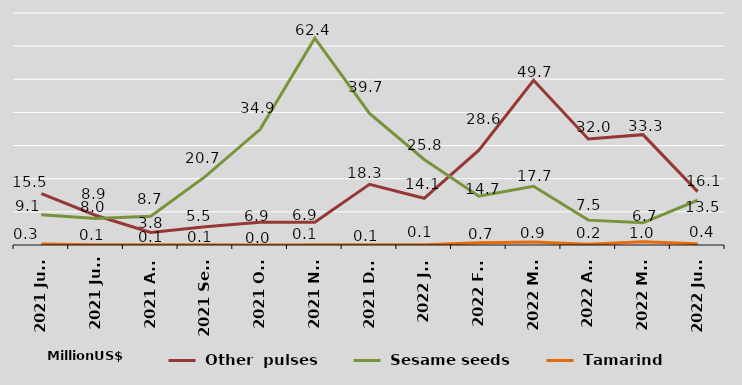
| Category |  Other  pulses |  Sesame seeds |  Tamarind |
|---|---|---|---|
| 2021 June | 15.5 | 9.1 | 0.3 |
| 2021 July | 8.9 | 8 | 0.1 |
| 2021 Aug | 3.8 | 8.7 | 0.1 |
| 2021 Sept | 5.5 | 20.7 | 0.1 |
| 2021 Oct | 6.9 | 34.9 | 0 |
| 2021 Nov | 6.9 | 62.4 | 0.1 |
| 2021 Dec | 18.3 | 39.7 | 0.1 |
| 2022 Jan | 14.1 | 25.8 | 0.1 |
| 2022 Feb | 28.6 | 14.7 | 0.7 |
| 2022 Mar | 49.7 | 17.7 | 0.9 |
| 2022 Apr | 32 | 7.5 | 0.2 |
| 2022 May | 33.3 | 6.7 | 1 |
| 2022 June | 16.1 | 13.5 | 0.4 |